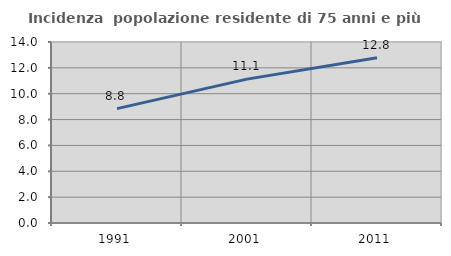
| Category | Incidenza  popolazione residente di 75 anni e più |
|---|---|
| 1991.0 | 8.848 |
| 2001.0 | 11.128 |
| 2011.0 | 12.789 |